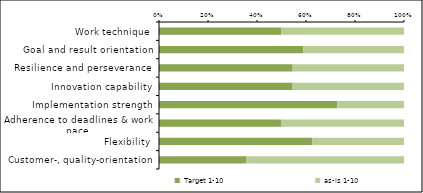
| Category | Target 1-10 | as-is 1-10 |
|---|---|---|
| Work technique | 10 | 10 |
| Goal and result orientation | 10 | 7 |
| Resilience and perseverance | 6 | 5 |
| Innovation capability | 6 | 5 |
| Implementation strength | 8 | 3 |
| Adherence to deadlines & work pace | 8 | 8 |
| Flexibility | 5 | 3 |
| Customer-, quality-orientation | 5 | 9 |